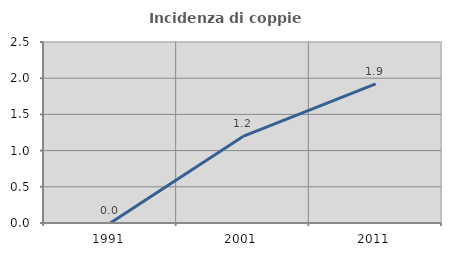
| Category | Incidenza di coppie miste |
|---|---|
| 1991.0 | 0 |
| 2001.0 | 1.195 |
| 2011.0 | 1.923 |